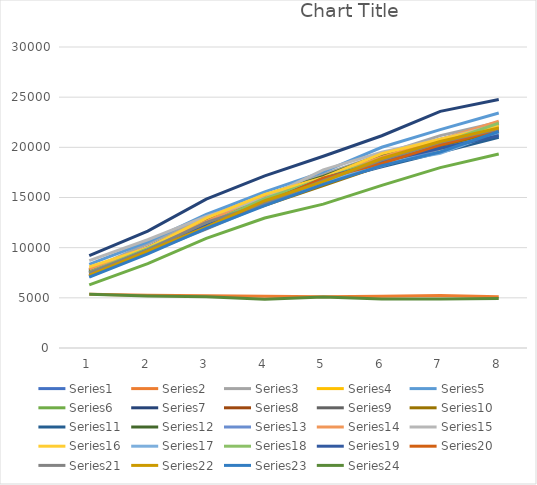
| Category | Series 0 | Series 1 | Series 2 | Series 3 | Series 4 | Series 5 | Series 6 | Series 7 | Series 8 | Series 9 | Series 10 | Series 11 | Series 12 | Series 13 | Series 14 | Series 15 | Series 16 | Series 17 | Series 18 | Series 19 | Series 20 | Series 21 | Series 22 | Series 23 |
|---|---|---|---|---|---|---|---|---|---|---|---|---|---|---|---|---|---|---|---|---|---|---|---|---|
| 0 | 7535 | 5362 | 7788 | 7406 | 8341 | 6286 | 9216 | 7784 | 7619 | 7692 | 7133 | 7667 | 7499 | 7855 | 8712 | 8085 | 7108 | 7540 | 7383 | 7241 | 7484 | 7226 | 7068 | 5357 |
| 1 | 10050 | 5265 | 10405 | 9590 | 10589 | 8412 | 11644 | 9941 | 9766 | 9905 | 9679 | 9894 | 9639 | 10028 | 10790 | 9982 | 9526 | 9909 | 9766 | 9676 | 9773 | 9646 | 9384 | 5190 |
| 2 | 12882 | 5198 | 13081 | 12271 | 13328 | 10918 | 14831 | 12717 | 12442 | 12296 | 12164 | 12623 | 12295 | 12595 | 13127 | 12945 | 11841 | 12329 | 12198 | 11892 | 12524 | 12058 | 11929 | 5112 |
| 3 | 14822 | 5157 | 15189 | 14578 | 15563 | 12951 | 17164 | 14948 | 14857 | 14210 | 14490 | 15210 | 14532 | 15218 | 14920 | 15309 | 14281 | 14891 | 14459 | 14387 | 14383 | 14681 | 14198 | 4848 |
| 4 | 16756 | 5096 | 17293 | 16896 | 17561 | 14341 | 19116 | 17005 | 16642 | 16200 | 16528 | 17095 | 16492 | 16927 | 17754 | 16979 | 16504 | 16879 | 16871 | 16919 | 16681 | 16589 | 16313 | 5088 |
| 5 | 19177 | 5170 | 19303 | 18387 | 20006 | 16212 | 21154 | 18680 | 18588 | 18187 | 18064 | 19259 | 18141 | 19026 | 19523 | 19379 | 18365 | 18837 | 18591 | 18384 | 18724 | 18885 | 18175 | 4881 |
| 6 | 20760 | 5238 | 21165 | 19860 | 21763 | 17980 | 23582 | 20789 | 20121 | 20033 | 19504 | 20737 | 19874 | 20771 | 20819 | 20805 | 19403 | 20370 | 19916 | 20250 | 20491 | 20576 | 19539 | 4879 |
| 7 | 22321 | 5113 | 22506 | 21249 | 23417 | 19333 | 24758 | 22266 | 21740 | 21670 | 21012 | 22022 | 21271 | 22618 | 22247 | 22112 | 21515 | 22405 | 21158 | 21742 | 21850 | 21935 | 21574 | 4932 |